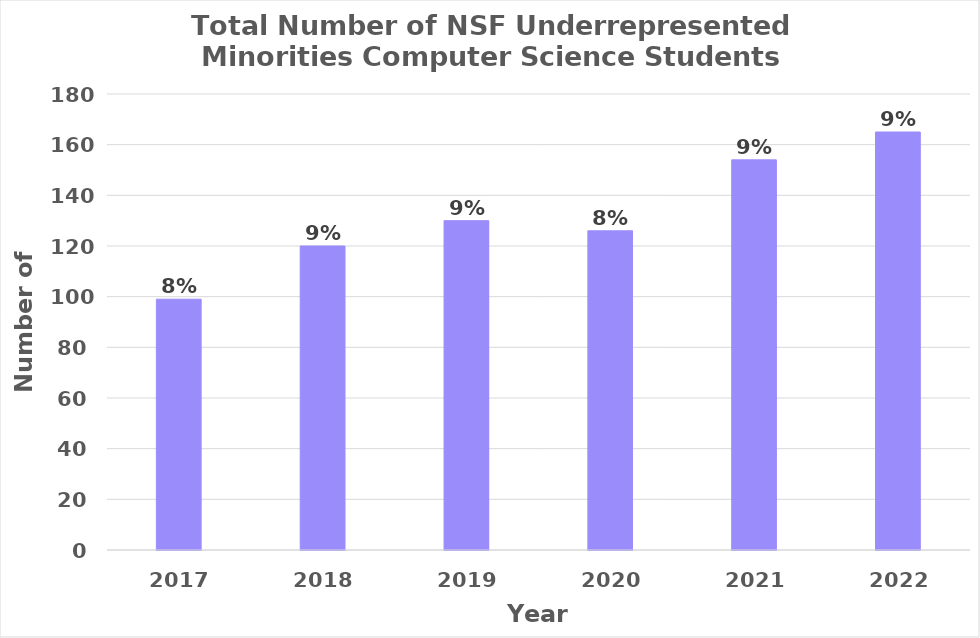
| Category | NSF Underrepresented Students |
|---|---|
| 2017.0 | 99 |
| 2018.0 | 120 |
| 2019.0 | 130 |
| 2020.0 | 126 |
| 2021.0 | 154 |
| 2022.0 | 165 |